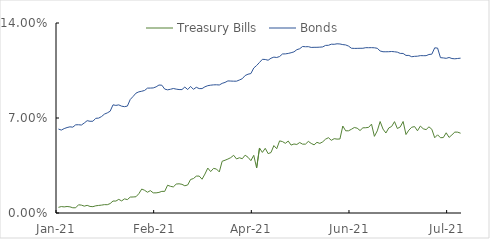
| Category | Treasury Bills | Bonds |
|---|---|---|
| Jan-21 | 0.004 | 0.062 |
| Jan-21 | 0.005 | 0.061 |
| Jan-21 | 0.004 | 0.062 |
| Jan-21 | 0.005 | 0.063 |
| Jan-21 | 0.005 | 0.063 |
| Jan-21 | 0.004 | 0.063 |
| Jan-21 | 0.004 | 0.065 |
| Jan-21 | 0.006 | 0.065 |
| Jan-21 | 0.006 | 0.065 |
| Jan-21 | 0.005 | 0.066 |
| Jan-21 | 0.006 | 0.068 |
| Jan-21 | 0.005 | 0.068 |
| Jan-21 | 0.005 | 0.068 |
| Jan-21 | 0.005 | 0.07 |
| Jan-21 | 0.006 | 0.07 |
| Jan-21 | 0.006 | 0.071 |
| Jan-21 | 0.006 | 0.073 |
| Jan-21 | 0.006 | 0.074 |
| Jan-21 | 0.007 | 0.075 |
| Jan-21 | 0.009 | 0.08 |
| Feb-21 | 0.009 | 0.079 |
| Feb-21 | 0.01 | 0.08 |
| Feb-21 | 0.009 | 0.079 |
| Feb-21 | 0.01 | 0.078 |
| Feb-21 | 0.01 | 0.079 |
| Feb-21 | 0.012 | 0.084 |
| Feb-21 | 0.012 | 0.086 |
| Feb-21 | 0.012 | 0.088 |
| Feb-21 | 0.014 | 0.089 |
| Feb-21 | 0.018 | 0.09 |
| Feb-21 | 0.017 | 0.09 |
| Feb-21 | 0.015 | 0.092 |
| Feb-21 | 0.016 | 0.092 |
| Feb-21 | 0.015 | 0.092 |
| Feb-21 | 0.015 | 0.093 |
| Feb-21 | 0.015 | 0.094 |
| Feb-21 | 0.016 | 0.094 |
| Feb-21 | 0.016 | 0.091 |
| Feb-21 | 0.02 | 0.091 |
| Feb-21 | 0.02 | 0.091 |
| Mar-21 | 0.019 | 0.092 |
| Mar-21 | 0.021 | 0.091 |
| Mar-21 | 0.022 | 0.091 |
| Mar-21 | 0.021 | 0.091 |
| Mar-21 | 0.02 | 0.093 |
| Mar-21 | 0.021 | 0.091 |
| Mar-21 | 0.025 | 0.093 |
| Mar-21 | 0.025 | 0.091 |
| Mar-21 | 0.027 | 0.093 |
| Mar-21 | 0.027 | 0.092 |
| Mar-21 | 0.025 | 0.092 |
| Mar-21 | 0.029 | 0.093 |
| Mar-21 | 0.033 | 0.094 |
| Mar-21 | 0.031 | 0.094 |
| Mar-21 | 0.033 | 0.094 |
| Mar-21 | 0.032 | 0.094 |
| Mar-21 | 0.03 | 0.094 |
| Mar-21 | 0.038 | 0.096 |
| Mar-21 | 0.039 | 0.096 |
| Mar-21 | 0.04 | 0.097 |
| Mar-21 | 0.041 | 0.097 |
| Mar-21 | 0.043 | 0.097 |
| Apr-21 | 0.04 | 0.097 |
| Apr-21 | 0.041 | 0.098 |
| Apr-21 | 0.04 | 0.099 |
| Apr-21 | 0.043 | 0.101 |
| Apr-21 | 0.041 | 0.102 |
| Apr-21 | 0.039 | 0.103 |
| Apr-21 | 0.043 | 0.107 |
| Apr-21 | 0.033 | 0.109 |
| Apr-21 | 0.048 | 0.111 |
| Apr-21 | 0.045 | 0.113 |
| Apr-21 | 0.048 | 0.113 |
| Apr-21 | 0.044 | 0.113 |
| Apr-21 | 0.045 | 0.114 |
| Apr-21 | 0.05 | 0.115 |
| Apr-21 | 0.047 | 0.115 |
| Apr-21 | 0.053 | 0.115 |
| Apr-21 | 0.053 | 0.117 |
| Apr-21 | 0.051 | 0.117 |
| Apr-21 | 0.053 | 0.118 |
| May-21 | 0.05 | 0.118 |
| May-21 | 0.051 | 0.119 |
| May-21 | 0.05 | 0.12 |
| May-21 | 0.052 | 0.121 |
| May-21 | 0.051 | 0.123 |
| May-21 | 0.051 | 0.123 |
| May-21 | 0.053 | 0.123 |
| May-21 | 0.051 | 0.122 |
| May-21 | 0.05 | 0.122 |
| May-21 | 0.052 | 0.122 |
| May-21 | 0.051 | 0.122 |
| May-21 | 0.052 | 0.122 |
| May-21 | 0.054 | 0.124 |
| May-21 | 0.055 | 0.124 |
| May-21 | 0.054 | 0.124 |
| May-21 | 0.055 | 0.124 |
| Jun-21 | 0.054 | 0.125 |
| Jun-21 | 0.055 | 0.125 |
| Jun-21 | 0.064 | 0.124 |
| Jun-21 | 0.061 | 0.124 |
| Jun-21 | 0.061 | 0.123 |
| Jun-21 | 0.062 | 0.121 |
| Jun-21 | 0.063 | 0.121 |
| Jun-21 | 0.063 | 0.121 |
| Jun-21 | 0.061 | 0.121 |
| Jun-21 | 0.063 | 0.121 |
| Jun-21 | 0.063 | 0.122 |
| Jun-21 | 0.063 | 0.122 |
| Jun-21 | 0.065 | 0.122 |
| Jun-21 | 0.056 | 0.122 |
| Jun-21 | 0.061 | 0.121 |
| Jun-21 | 0.067 | 0.119 |
| Jun-21 | 0.062 | 0.119 |
| Jun-21 | 0.059 | 0.119 |
| Jun-21 | 0.063 | 0.119 |
| Jun-21 | 0.064 | 0.119 |
| Jun-21 | 0.067 | 0.119 |
| Jul-21 | 0.062 | 0.119 |
| Jul-21 | 0.063 | 0.118 |
| Jul-21 | 0.067 | 0.118 |
| Jul-21 | 0.058 | 0.116 |
| Jul-21 | 0.061 | 0.116 |
| Jul-21 | 0.063 | 0.115 |
| Jul-21 | 0.064 | 0.115 |
| Jul-21 | 0.061 | 0.116 |
| Jul-21 | 0.064 | 0.116 |
| Jul-21 | 0.062 | 0.116 |
| Jul-21 | 0.061 | 0.116 |
| Jul-21 | 0.063 | 0.117 |
| Jul-21 | 0.062 | 0.117 |
| Jul-21 | 0.055 | 0.122 |
| Jul-21 | 0.058 | 0.122 |
| Jul-21 | 0.055 | 0.114 |
| Jul-21 | 0.056 | 0.114 |
| Jul-21 | 0.059 | 0.114 |
| Jul-21 | 0.056 | 0.115 |
| Jul-21 | 0.058 | 0.114 |
| Jul-21 | 0.06 | 0.114 |
| Jul-21 | 0.06 | 0.114 |
| Jul-21 | 0.059 | 0.114 |